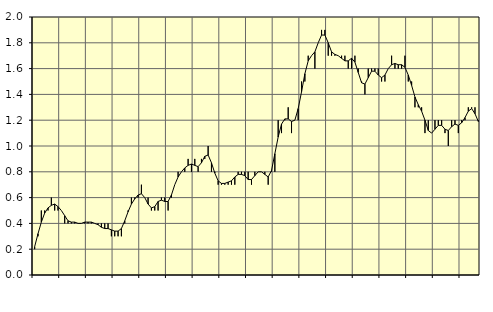
| Category | Piggar | Anställda utomlands |
|---|---|---|
| nan | 0.2 | 0.22 |
| 87.0 | 0.3 | 0.32 |
| 87.0 | 0.5 | 0.41 |
| 87.0 | 0.5 | 0.48 |
| nan | 0.5 | 0.52 |
| 88.0 | 0.6 | 0.54 |
| 88.0 | 0.5 | 0.55 |
| 88.0 | 0.5 | 0.53 |
| nan | 0.5 | 0.5 |
| 89.0 | 0.4 | 0.46 |
| 89.0 | 0.4 | 0.42 |
| 89.0 | 0.4 | 0.41 |
| nan | 0.4 | 0.41 |
| 90.0 | 0.4 | 0.4 |
| 90.0 | 0.4 | 0.4 |
| 90.0 | 0.4 | 0.41 |
| nan | 0.4 | 0.41 |
| 91.0 | 0.4 | 0.41 |
| 91.0 | 0.4 | 0.4 |
| 91.0 | 0.4 | 0.39 |
| nan | 0.4 | 0.37 |
| 92.0 | 0.4 | 0.36 |
| 92.0 | 0.4 | 0.36 |
| 92.0 | 0.3 | 0.35 |
| nan | 0.3 | 0.34 |
| 93.0 | 0.3 | 0.34 |
| 93.0 | 0.3 | 0.36 |
| 93.0 | 0.4 | 0.42 |
| nan | 0.5 | 0.49 |
| 94.0 | 0.6 | 0.55 |
| 94.0 | 0.6 | 0.59 |
| 94.0 | 0.6 | 0.62 |
| nan | 0.7 | 0.63 |
| 95.0 | 0.6 | 0.6 |
| 95.0 | 0.6 | 0.55 |
| 95.0 | 0.5 | 0.52 |
| nan | 0.5 | 0.53 |
| 96.0 | 0.5 | 0.57 |
| 96.0 | 0.6 | 0.58 |
| 96.0 | 0.6 | 0.57 |
| nan | 0.5 | 0.57 |
| 97.0 | 0.6 | 0.62 |
| 97.0 | 0.7 | 0.7 |
| 97.0 | 0.8 | 0.76 |
| nan | 0.8 | 0.8 |
| 98.0 | 0.8 | 0.83 |
| 98.0 | 0.9 | 0.85 |
| 98.0 | 0.8 | 0.86 |
| nan | 0.9 | 0.85 |
| 99.0 | 0.8 | 0.84 |
| 99.0 | 0.9 | 0.87 |
| 99.0 | 0.9 | 0.92 |
| nan | 1 | 0.93 |
| 0.0 | 0.8 | 0.87 |
| 0.0 | 0.8 | 0.79 |
| 0.0 | 0.7 | 0.73 |
| nan | 0.7 | 0.71 |
| 1.0 | 0.7 | 0.71 |
| 1.0 | 0.7 | 0.72 |
| 1.0 | 0.7 | 0.73 |
| nan | 0.7 | 0.76 |
| 2.0 | 0.8 | 0.78 |
| 2.0 | 0.8 | 0.78 |
| 2.0 | 0.8 | 0.77 |
| nan | 0.8 | 0.74 |
| 3.0 | 0.7 | 0.74 |
| 3.0 | 0.8 | 0.77 |
| 3.0 | 0.8 | 0.8 |
| nan | 0.8 | 0.8 |
| 4.0 | 0.8 | 0.78 |
| 4.0 | 0.7 | 0.76 |
| 4.0 | 0.8 | 0.81 |
| nan | 0.8 | 0.94 |
| 5.0 | 1.2 | 1.07 |
| 5.0 | 1.1 | 1.17 |
| 5.0 | 1.2 | 1.21 |
| nan | 1.3 | 1.21 |
| 6.0 | 1.1 | 1.19 |
| 6.0 | 1.2 | 1.2 |
| 6.0 | 1.2 | 1.29 |
| nan | 1.5 | 1.42 |
| 7.0 | 1.5 | 1.56 |
| 7.0 | 1.7 | 1.66 |
| 7.0 | 1.7 | 1.7 |
| nan | 1.6 | 1.73 |
| 8.0 | 1.8 | 1.8 |
| 8.0 | 1.9 | 1.86 |
| 8.0 | 1.9 | 1.86 |
| nan | 1.7 | 1.8 |
| 9.0 | 1.7 | 1.73 |
| 9.0 | 1.7 | 1.71 |
| 9.0 | 1.7 | 1.7 |
| nan | 1.7 | 1.68 |
| 10.0 | 1.7 | 1.66 |
| 10.0 | 1.6 | 1.66 |
| 10.0 | 1.6 | 1.68 |
| nan | 1.7 | 1.65 |
| 11.0 | 1.6 | 1.57 |
| 11.0 | 1.5 | 1.49 |
| 11.0 | 1.4 | 1.48 |
| nan | 1.6 | 1.53 |
| 12.0 | 1.6 | 1.58 |
| 12.0 | 1.6 | 1.58 |
| 12.0 | 1.6 | 1.55 |
| nan | 1.5 | 1.53 |
| 13.0 | 1.5 | 1.55 |
| 13.0 | 1.6 | 1.6 |
| 13.0 | 1.7 | 1.63 |
| nan | 1.6 | 1.64 |
| 14.0 | 1.6 | 1.63 |
| 14.0 | 1.6 | 1.63 |
| 14.0 | 1.7 | 1.61 |
| nan | 1.5 | 1.55 |
| 15.0 | 1.5 | 1.47 |
| 15.0 | 1.3 | 1.38 |
| 15.0 | 1.3 | 1.32 |
| nan | 1.3 | 1.27 |
| 16.0 | 1.1 | 1.2 |
| 16.0 | 1.2 | 1.12 |
| 16.0 | 1.1 | 1.1 |
| nan | 1.2 | 1.13 |
| 17.0 | 1.2 | 1.16 |
| 17.0 | 1.2 | 1.16 |
| 17.0 | 1.1 | 1.13 |
| nan | 1 | 1.12 |
| 18.0 | 1.2 | 1.15 |
| 18.0 | 1.2 | 1.17 |
| 18.0 | 1.1 | 1.16 |
| nan | 1.2 | 1.18 |
| 19.0 | 1.2 | 1.22 |
| 19.0 | 1.3 | 1.27 |
| 19.0 | 1.3 | 1.29 |
| nan | 1.3 | 1.25 |
| 20.0 | 1.2 | 1.19 |